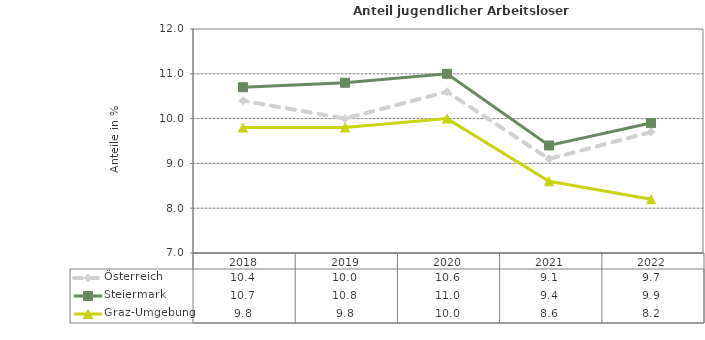
| Category | Österreich | Steiermark | Graz-Umgebung |
|---|---|---|---|
| 2022.0 | 9.7 | 9.9 | 8.2 |
| 2021.0 | 9.1 | 9.4 | 8.6 |
| 2020.0 | 10.6 | 11 | 10 |
| 2019.0 | 10 | 10.8 | 9.8 |
| 2018.0 | 10.4 | 10.7 | 9.8 |